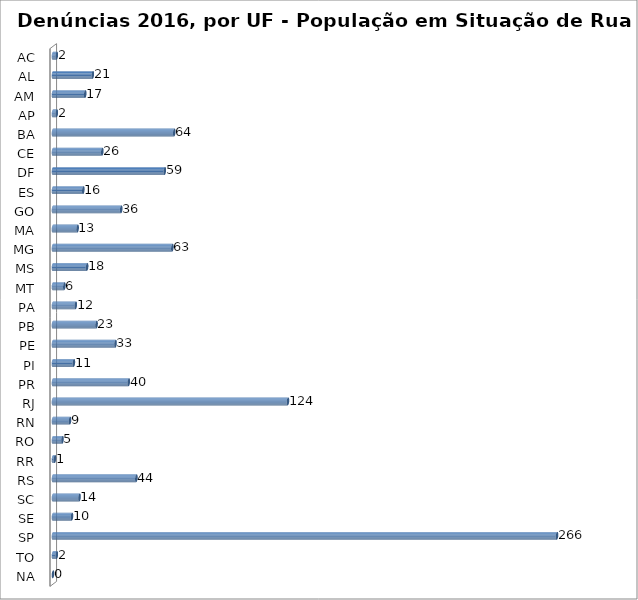
| Category | Series 0 |
|---|---|
| AC | 2 |
| AL | 21 |
| AM | 17 |
| AP | 2 |
| BA | 64 |
| CE | 26 |
| DF | 59 |
| ES | 16 |
| GO | 36 |
| MA | 13 |
| MG | 63 |
| MS | 18 |
| MT | 6 |
| PA | 12 |
| PB | 23 |
| PE | 33 |
| PI | 11 |
| PR | 40 |
| RJ | 124 |
| RN | 9 |
| RO | 5 |
| RR | 1 |
| RS | 44 |
| SC | 14 |
| SE | 10 |
| SP | 266 |
| TO | 2 |
| NA | 0 |